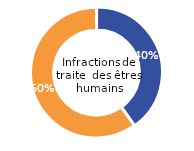
| Category | Infractions de traite des êtres humains |
|---|---|
| Femme | 40.09 |
| Homme | 59.91 |